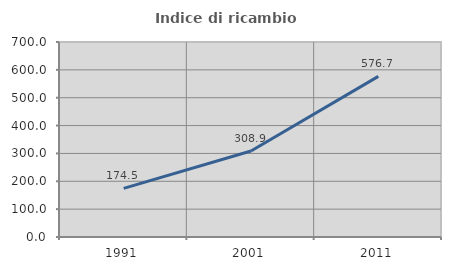
| Category | Indice di ricambio occupazionale  |
|---|---|
| 1991.0 | 174.477 |
| 2001.0 | 308.906 |
| 2011.0 | 576.718 |